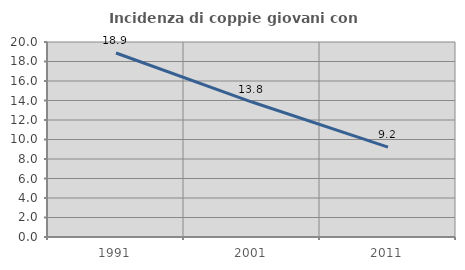
| Category | Incidenza di coppie giovani con figli |
|---|---|
| 1991.0 | 18.874 |
| 2001.0 | 13.842 |
| 2011.0 | 9.222 |